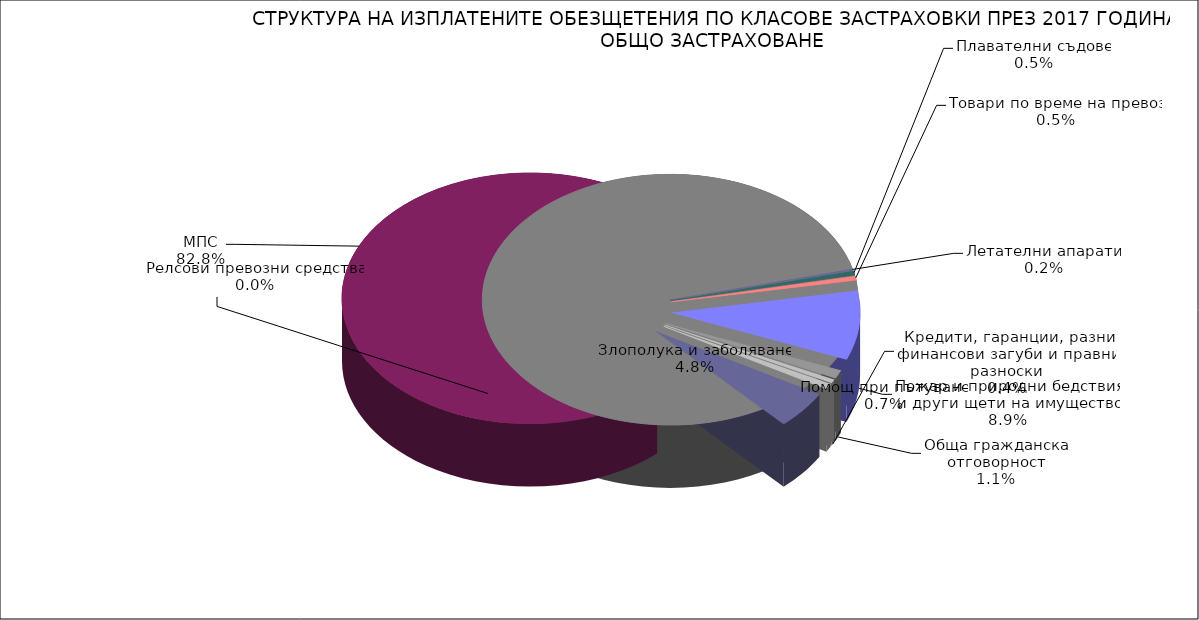
| Category | Series 0 |
|---|---|
| Злополука и заболяване | 0.048 |
| МПС | 0.828 |
| Релсови превозни средства | 0 |
| Летателни апарати | 0.002 |
| Плавателни съдове | 0.005 |
| Товари по време на превоз | 0.005 |
| Пожар и природни бедствия и други щети на имущество | 0.089 |
| Обща гражданска отговорност | 0.011 |
| Кредити, гаранции, разни финансови загуби и правни разноски | 0.004 |
| Помощ при пътуване | 0.007 |